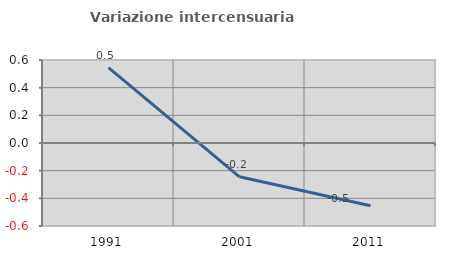
| Category | Variazione intercensuaria annua |
|---|---|
| 1991.0 | 0.544 |
| 2001.0 | -0.245 |
| 2011.0 | -0.454 |